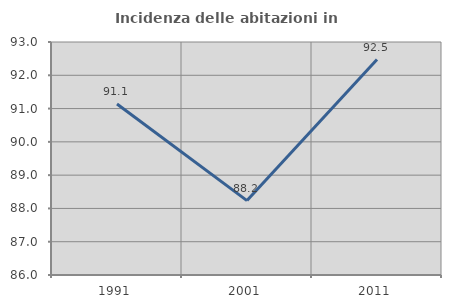
| Category | Incidenza delle abitazioni in proprietà  |
|---|---|
| 1991.0 | 91.139 |
| 2001.0 | 88.235 |
| 2011.0 | 92.473 |